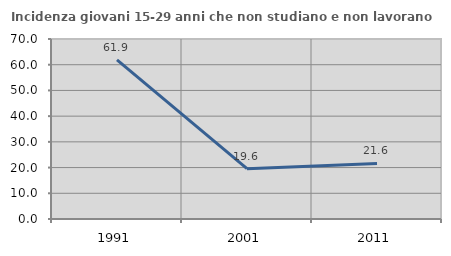
| Category | Incidenza giovani 15-29 anni che non studiano e non lavorano  |
|---|---|
| 1991.0 | 61.905 |
| 2001.0 | 19.574 |
| 2011.0 | 21.615 |